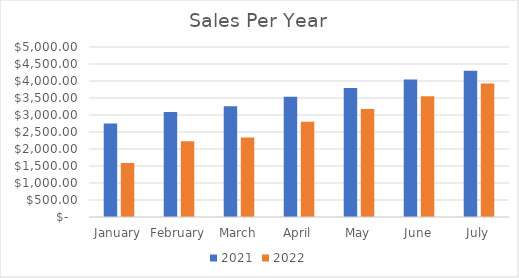
| Category | 2021 | 2022 |
|---|---|---|
| January | 2750 | 1588 |
| February | 3086 | 2229 |
| March | 3258 | 2337 |
| April | 3539.333 | 2800.333 |
| May | 3793.333 | 3174.833 |
| June | 4047.333 | 3549.333 |
| July | 4301.333 | 3923.833 |